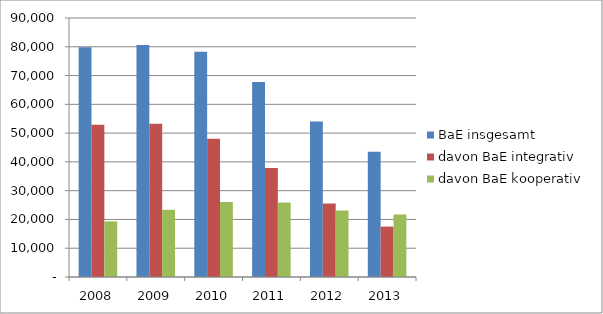
| Category | BaE insgesamt | davon BaE integrativ | davon BaE kooperativ |
|---|---|---|---|
| 2008.0 | 79846 | 52888 | 19329.417 |
| 2009.0 | 80632.417 | 53246.917 | 23382.667 |
| 2010.0 | 78292.333 | 48062.917 | 26091.583 |
| 2011.0 | 67788.583 | 37918.5 | 25855.833 |
| 2012.0 | 54013.083 | 25571.167 | 23143.75 |
| 2013.0 | 43538 | 17509 | 21725.083 |